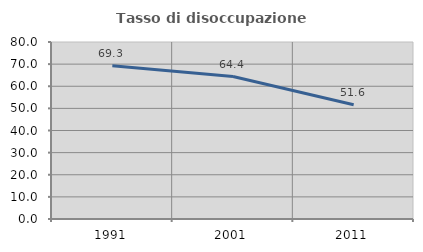
| Category | Tasso di disoccupazione giovanile  |
|---|---|
| 1991.0 | 69.266 |
| 2001.0 | 64.407 |
| 2011.0 | 51.637 |